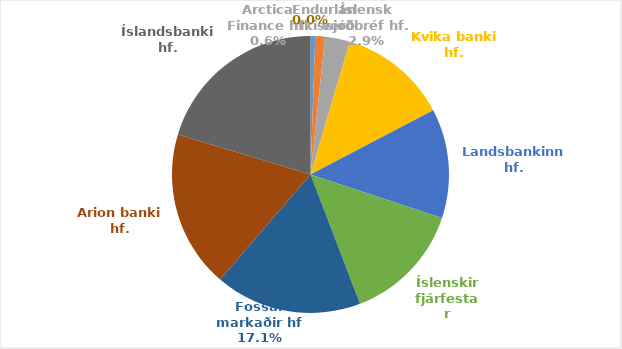
| Category | Total % |
|---|---|
| Arctica Finance hf. | 0.005 |
| Endurlán ríkissjóðs | 0.011 |
| Íslensk verðbréf hf. | 0.029 |
| Kvika banki hf. | 0.127 |
| Landsbankinn hf. | 0.128 |
| Íslenskir fjárfestar | 0.141 |
| Fossar markaðir hf | 0.171 |
| Arion banki hf. | 0.184 |
| Íslandsbanki hf. | 0.203 |